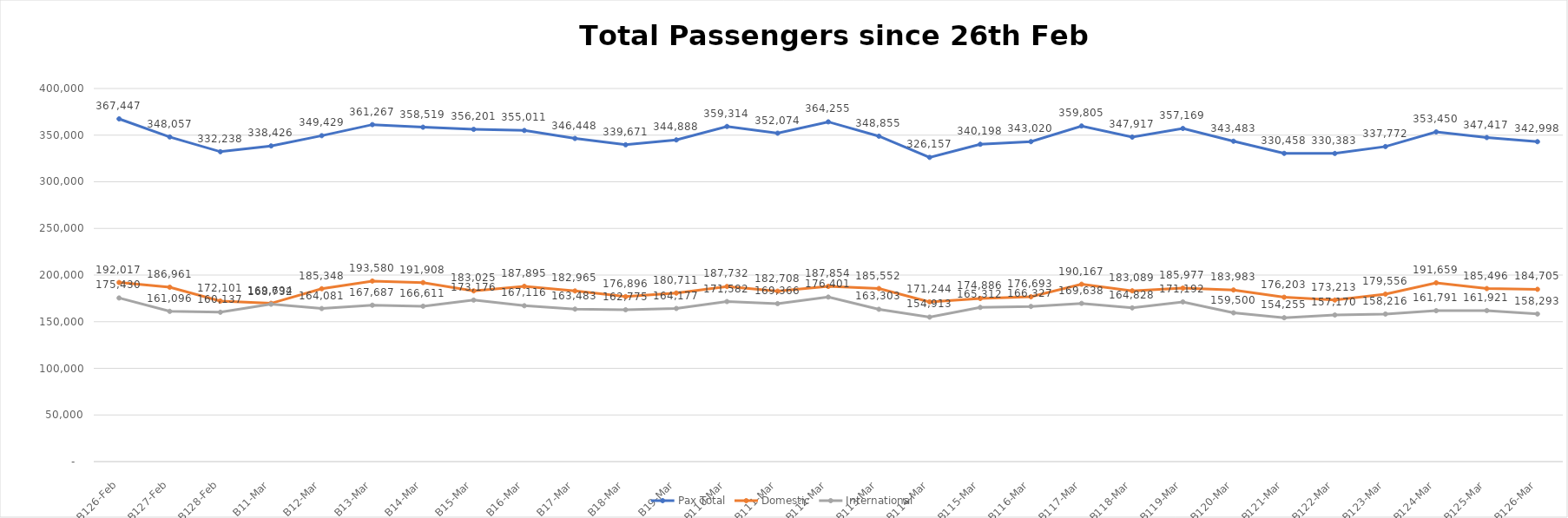
| Category | Pax Total |  Domestic  |  International  |
|---|---|---|---|
| 2023-02-26 | 367447 | 192017 | 175430 |
| 2023-02-27 | 348057 | 186961 | 161096 |
| 2023-02-28 | 332238 | 172101 | 160137 |
| 2023-03-01 | 338426 | 169694 | 168732 |
| 2023-03-02 | 349429 | 185348 | 164081 |
| 2023-03-03 | 361267 | 193580 | 167687 |
| 2023-03-04 | 358519 | 191908 | 166611 |
| 2023-03-05 | 356201 | 183025 | 173176 |
| 2023-03-06 | 355011 | 187895 | 167116 |
| 2023-03-07 | 346448 | 182965 | 163483 |
| 2023-03-08 | 339671 | 176896 | 162775 |
| 2023-03-09 | 344888 | 180711 | 164177 |
| 2023-03-10 | 359314 | 187732 | 171582 |
| 2023-03-11 | 352074 | 182708 | 169366 |
| 2023-03-12 | 364255 | 187854 | 176401 |
| 2023-03-13 | 348855 | 185552 | 163303 |
| 2023-03-14 | 326157 | 171244 | 154913 |
| 2023-03-15 | 340198 | 174886 | 165312 |
| 2023-03-16 | 343020 | 176693 | 166327 |
| 2023-03-17 | 359805 | 190167 | 169638 |
| 2023-03-18 | 347917 | 183089 | 164828 |
| 2023-03-19 | 357169 | 185977 | 171192 |
| 2023-03-20 | 343483 | 183983 | 159500 |
| 2023-03-21 | 330458 | 176203 | 154255 |
| 2023-03-22 | 330383 | 173213 | 157170 |
| 2023-03-23 | 337772 | 179556 | 158216 |
| 2023-03-24 | 353450 | 191659 | 161791 |
| 2023-03-25 | 347417 | 185496 | 161921 |
| 2023-03-26 | 342998 | 184705 | 158293 |